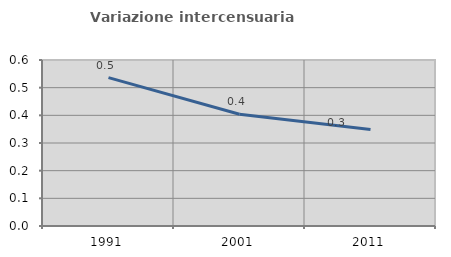
| Category | Variazione intercensuaria annua |
|---|---|
| 1991.0 | 0.536 |
| 2001.0 | 0.404 |
| 2011.0 | 0.349 |